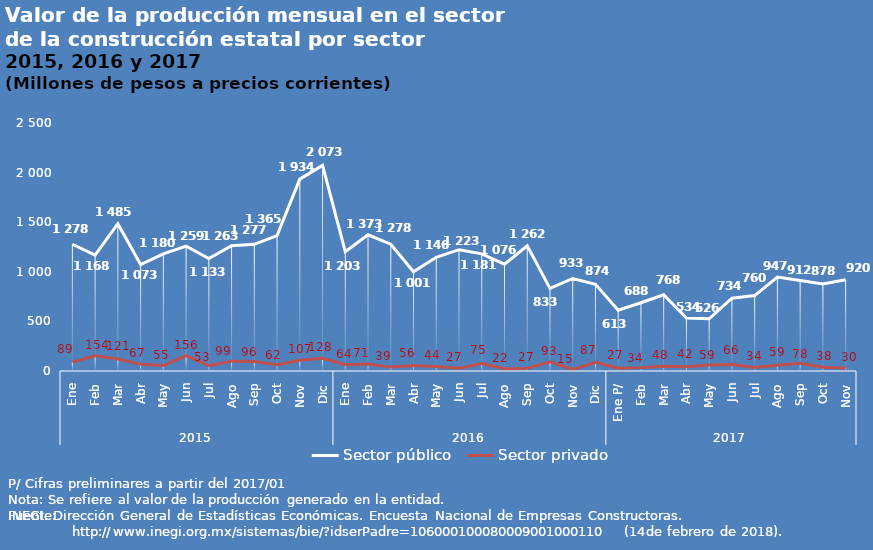
| Category | Sector público | Sector privado |
|---|---|---|
| 0 | 1277.582 | 89.007 |
| 1 | 1168.193 | 154.37 |
| 2 | 1484.663 | 120.976 |
| 3 | 1073.253 | 66.84 |
| 4 | 1180.155 | 55.081 |
| 5 | 1258.886 | 155.917 |
| 6 | 1133.421 | 52.743 |
| 7 | 1263.413 | 99.434 |
| 8 | 1276.627 | 95.713 |
| 9 | 1365.395 | 62.097 |
| 10 | 1934.078 | 107.472 |
| 11 | 2072.994 | 127.95 |
| 12 | 1202.904 | 63.507 |
| 13 | 1373.422 | 70.787 |
| 14 | 1277.919 | 39.182 |
| 15 | 1001.126 | 55.695 |
| 16 | 1146.009 | 44.193 |
| 17 | 1222.891 | 27.144 |
| 18 | 1180.541 | 74.935 |
| 19 | 1076.337 | 22.183 |
| 20 | 1261.991 | 27.438 |
| 21 | 832.594 | 93.133 |
| 22 | 932.77 | 15.125 |
| 23 | 873.517 | 87.412 |
| 24 | 613.086 | 27.073 |
| 25 | 687.775 | 34.02 |
| 26 | 768.408 | 48.065 |
| 27 | 533.879 | 42.436 |
| 28 | 526.213 | 59.245 |
| 29 | 734.327 | 65.871 |
| 30 | 760.143 | 34.435 |
| 31 | 947.052 | 58.746 |
| 32 | 911.778 | 78.366 |
| 33 | 877.509 | 38.078 |
| 34 | 920.218 | 30.201 |